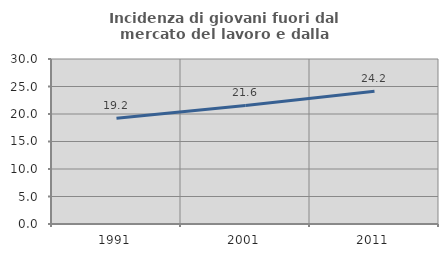
| Category | Incidenza di giovani fuori dal mercato del lavoro e dalla formazione  |
|---|---|
| 1991.0 | 19.245 |
| 2001.0 | 21.562 |
| 2011.0 | 24.153 |